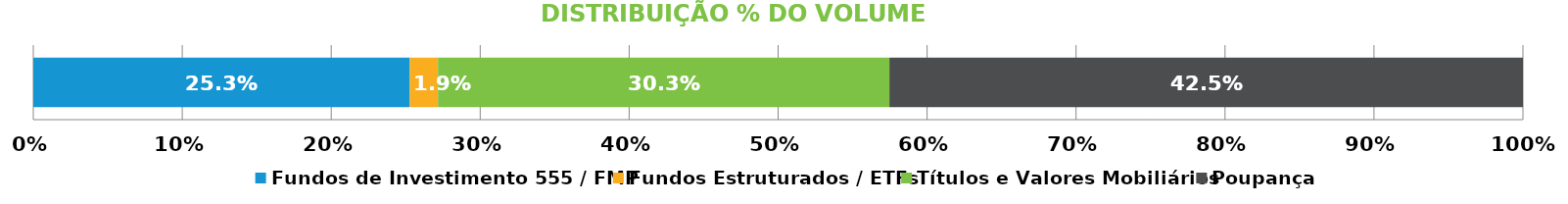
| Category | Fundos de Investimento 555 / FMP | Fundos Estruturados / ETFs | Títulos e Valores Mobiliários | Poupança |
|---|---|---|---|---|
| 0 | 0.253 | 0.019 | 0.303 | 0.425 |